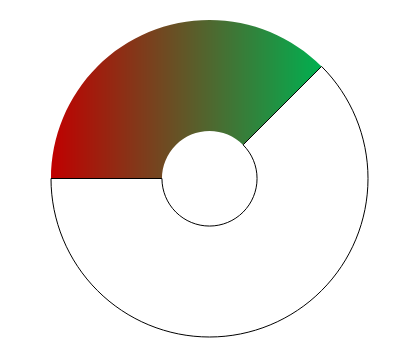
| Category | Series 0 |
|---|---|
| 0 | 135 |
| 1 | 225 |